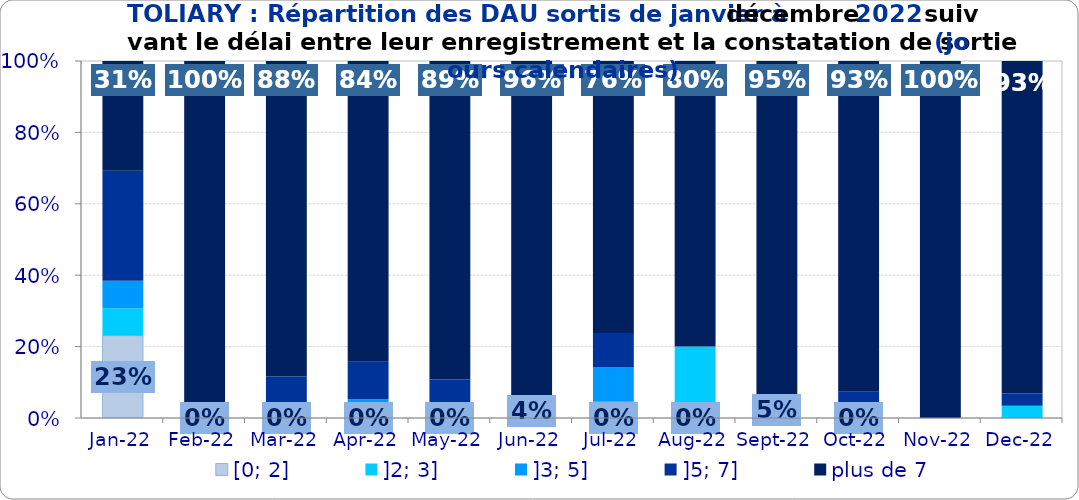
| Category | [0; 2] | ]2; 3] | ]3; 5] | ]5; 7] | plus de 7 |
|---|---|---|---|---|---|
| 2022-01-01 | 0.231 | 0.077 | 0.077 | 0.308 | 0.308 |
| 2022-02-01 | 0 | 0 | 0 | 0 | 1 |
| 2022-03-01 | 0 | 0 | 0.029 | 0.087 | 0.884 |
| 2022-04-01 | 0 | 0 | 0.053 | 0.105 | 0.842 |
| 2022-05-01 | 0 | 0 | 0.015 | 0.092 | 0.892 |
| 2022-06-01 | 0.04 | 0 | 0 | 0 | 0.96 |
| 2022-07-01 | 0 | 0.048 | 0.095 | 0.095 | 0.762 |
| 2022-08-01 | 0 | 0.2 | 0 | 0 | 0.8 |
| 2022-09-01 | 0.048 | 0 | 0 | 0 | 0.952 |
| 2022-10-01 | 0 | 0 | 0 | 0.074 | 0.926 |
| 2022-11-01 | 0 | 0 | 0 | 0 | 1 |
| 2022-12-01 | 0 | 0.034 | 0 | 0.034 | 0.931 |